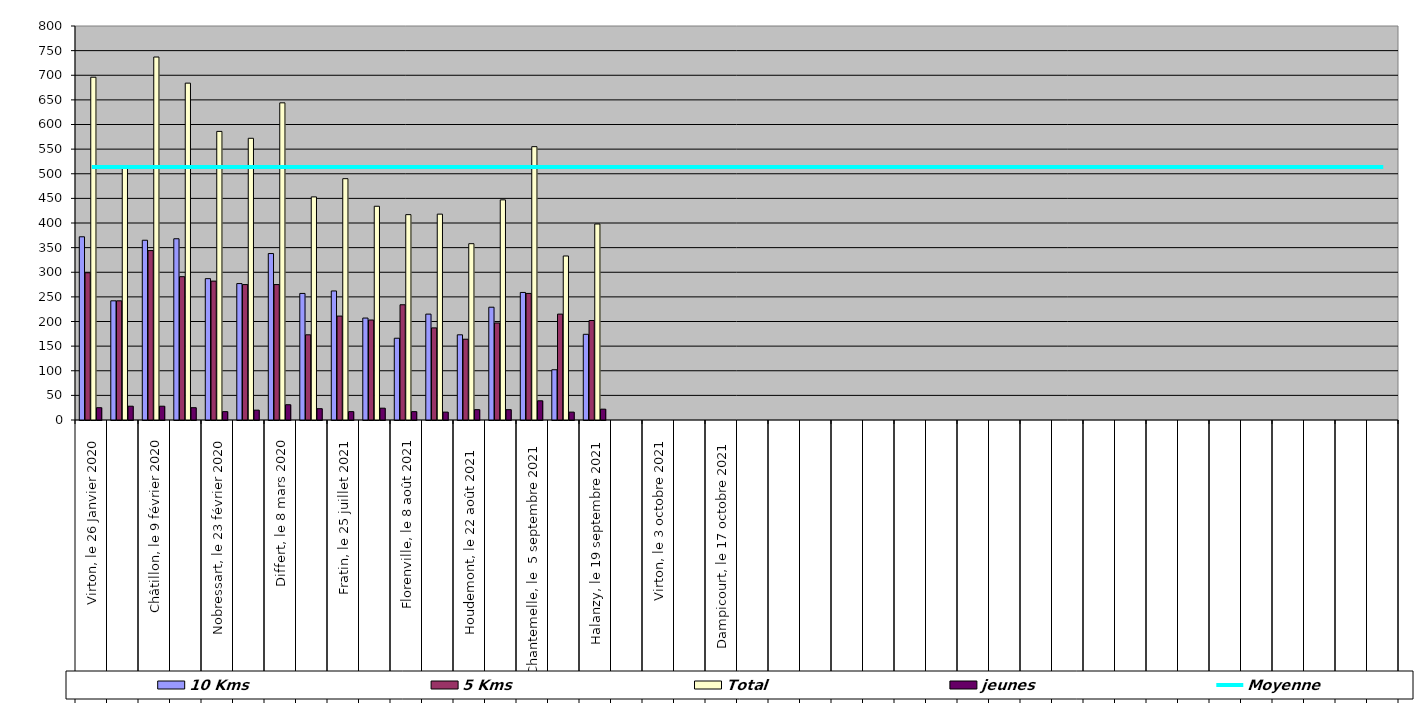
| Category | 10 Kms | 5 Kms | Total | jeunes |
|---|---|---|---|---|
| 0 | 372 | 299 | 696 | 25 |
| 1 | 242 | 242 | 512 | 28 |
| 2 | 365 | 344 | 737 | 28 |
| 3 | 368 | 291 | 684 | 25 |
| 4 | 287 | 282 | 586 | 17 |
| 5 | 277 | 275 | 572 | 20 |
| 6 | 338 | 275 | 644 | 31 |
| 7 | 257 | 173 | 453 | 23 |
| 8 | 262 | 211 | 490 | 17 |
| 9 | 207 | 203 | 434 | 24 |
| 10 | 166 | 234 | 417 | 17 |
| 11 | 215 | 187 | 418 | 16 |
| 12 | 173 | 164 | 358 | 21 |
| 13 | 229 | 197 | 447 | 21 |
| 14 | 259 | 257 | 555 | 39 |
| 15 | 102 | 215 | 333 | 16 |
| 16 | 174 | 202 | 398 | 22 |
| 17 | 0 | 0 | 0 | 0 |
| 18 | 0 | 0 | 0 | 0 |
| 19 | 0 | 0 | 0 | 0 |
| 20 | 0 | 0 | 0 | 0 |
| 21 | 0 | 0 | 0 | 0 |
| 22 | 0 | 0 | 0 | 0 |
| 23 | 0 | 0 | 0 | 0 |
| 24 | 0 | 0 | 0 | 0 |
| 25 | 0 | 0 | 0 | 0 |
| 26 | 0 | 0 | 0 | 0 |
| 27 | 0 | 0 | 0 | 0 |
| 28 | 0 | 0 | 0 | 0 |
| 29 | 0 | 0 | 0 | 0 |
| 30 | 0 | 0 | 0 | 0 |
| 31 | 0 | 0 | 0 | 0 |
| 32 | 0 | 0 | 0 | 0 |
| 33 | 0 | 0 | 0 | 0 |
| 34 | 0 | 0 | 0 | 0 |
| 35 | 0 | 0 | 0 | 0 |
| 36 | 0 | 0 | 0 | 0 |
| 37 | 0 | 0 | 0 | 0 |
| 38 | 0 | 0 | 0 | 0 |
| 39 | 0 | 0 | 0 | 0 |
| 40 | 0 | 0 | 0 | 0 |
| 41 | 0 | 0 | 0 | 0 |